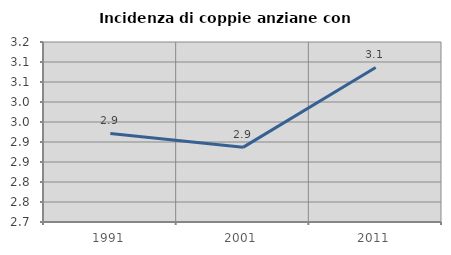
| Category | Incidenza di coppie anziane con figli |
|---|---|
| 1991.0 | 2.921 |
| 2001.0 | 2.887 |
| 2011.0 | 3.086 |